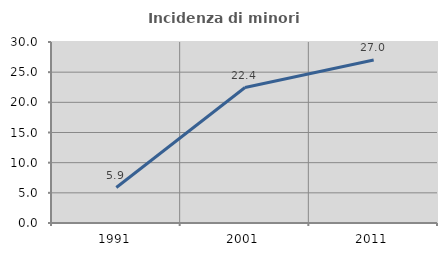
| Category | Incidenza di minori stranieri |
|---|---|
| 1991.0 | 5.882 |
| 2001.0 | 22.449 |
| 2011.0 | 27.027 |